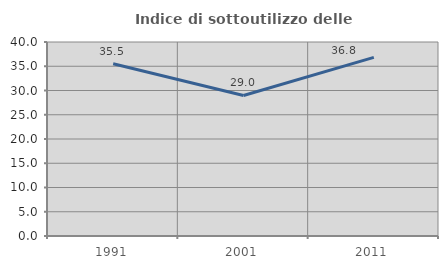
| Category | Indice di sottoutilizzo delle abitazioni  |
|---|---|
| 1991.0 | 35.514 |
| 2001.0 | 28.972 |
| 2011.0 | 36.842 |